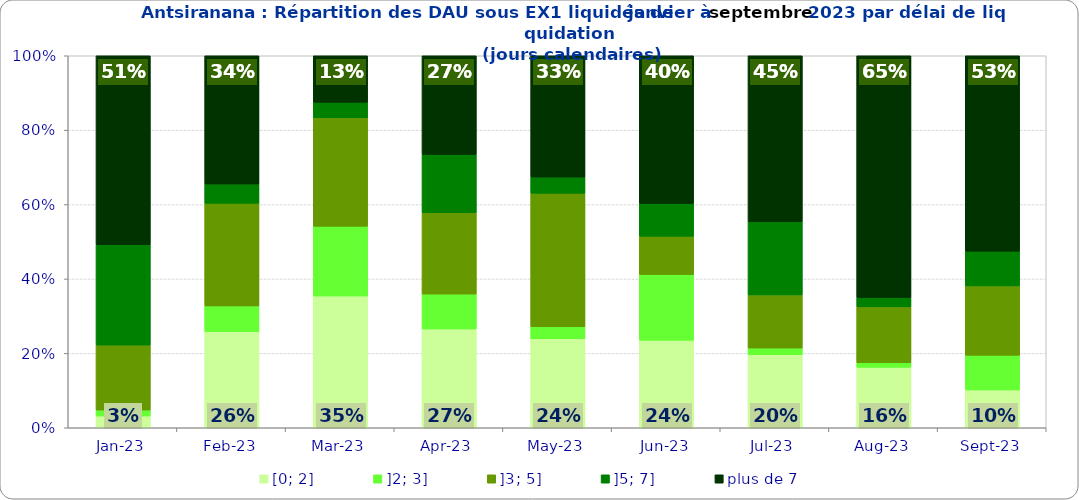
| Category | [0; 2] | ]2; 3] | ]3; 5] | ]5; 7] | plus de 7 |
|---|---|---|---|---|---|
| 2023-01-01 | 0.032 | 0.016 | 0.175 | 0.27 | 0.508 |
| 2023-02-01 | 0.259 | 0.069 | 0.276 | 0.052 | 0.345 |
| 2023-03-01 | 0.354 | 0.188 | 0.292 | 0.042 | 0.125 |
| 2023-04-01 | 0.266 | 0.094 | 0.219 | 0.156 | 0.266 |
| 2023-05-01 | 0.239 | 0.033 | 0.359 | 0.043 | 0.326 |
| 2023-06-01 | 0.235 | 0.176 | 0.103 | 0.088 | 0.397 |
| 2023-07-01 | 0.196 | 0.018 | 0.143 | 0.196 | 0.446 |
| 2023-08-01 | 0.162 | 0.012 | 0.15 | 0.025 | 0.65 |
| 2023-09-01 | 0.102 | 0.093 | 0.186 | 0.093 | 0.525 |